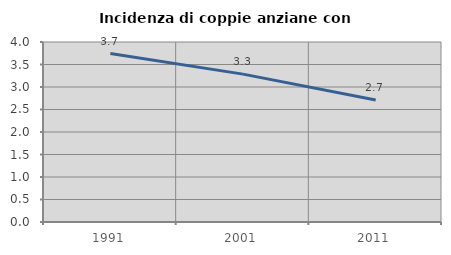
| Category | Incidenza di coppie anziane con figli |
|---|---|
| 1991.0 | 3.743 |
| 2001.0 | 3.286 |
| 2011.0 | 2.713 |